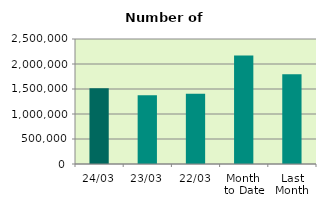
| Category | Series 0 |
|---|---|
| 24/03 | 1514048 |
| 23/03 | 1372664 |
| 22/03 | 1406862 |
| Month 
to Date | 2168679.667 |
| Last
Month | 1795830.8 |